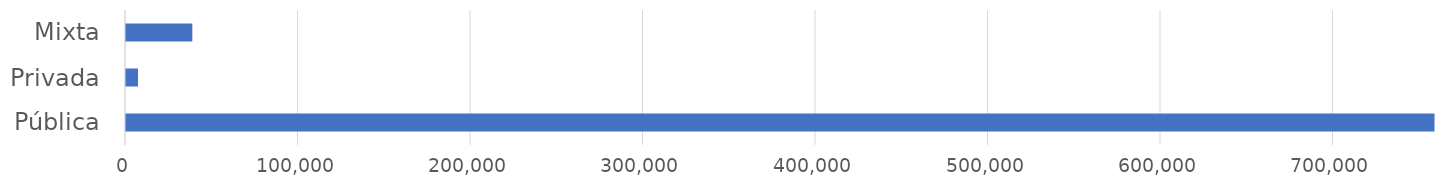
| Category | Series 0 |
|---|---|
| Pública | 759148.29 |
| Privada | 7542.402 |
| Mixta | 39027.586 |